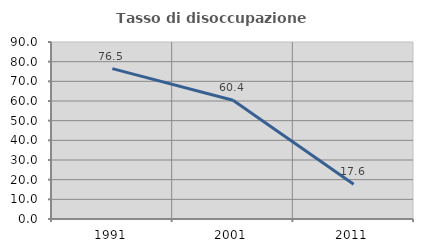
| Category | Tasso di disoccupazione giovanile  |
|---|---|
| 1991.0 | 76.471 |
| 2001.0 | 60.377 |
| 2011.0 | 17.647 |